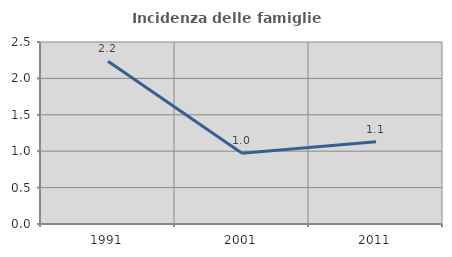
| Category | Incidenza delle famiglie numerose |
|---|---|
| 1991.0 | 2.236 |
| 2001.0 | 0.97 |
| 2011.0 | 1.129 |